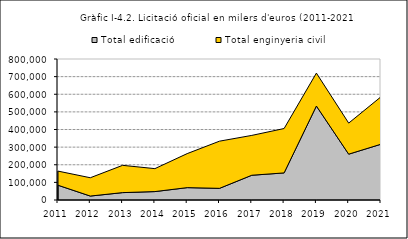
| Category | Total edificació | Total enginyeria civil |
|---|---|---|
| 2011.0 | 83862 | 80090 |
| 2012.0 | 22405 | 103886 |
| 2013.0 | 41900 | 154775 |
| 2014.0 | 47770 | 130206 |
| 2015.0 | 70191 | 193028 |
| 2016.0 | 66132 | 267685 |
| 2017.0 | 140500 | 226050 |
| 2018.0 | 153660 | 251900 |
| 2019.0 | 533210 | 186880 |
| 2020.0 | 260034 | 176245 |
| 2021.0 | 316520 | 269137 |